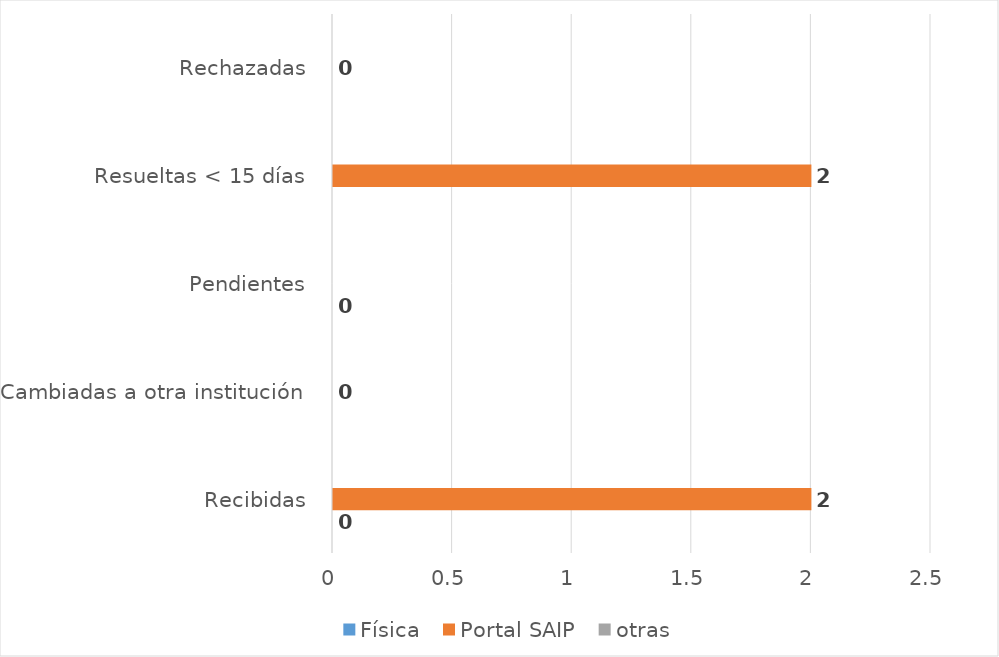
| Category | Física | Portal SAIP | otras |
|---|---|---|---|
| Recibidas | 0 | 2 | 0 |
| Cambiadas a otra institución | 0 | 0 | 0 |
| Pendientes | 0 | 0 | 0 |
| Resueltas < 15 días | 0 | 2 | 0 |
| Rechazadas | 0 | 0 | 0 |